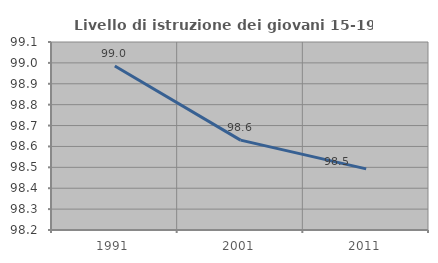
| Category | Livello di istruzione dei giovani 15-19 anni |
|---|---|
| 1991.0 | 98.985 |
| 2001.0 | 98.63 |
| 2011.0 | 98.492 |